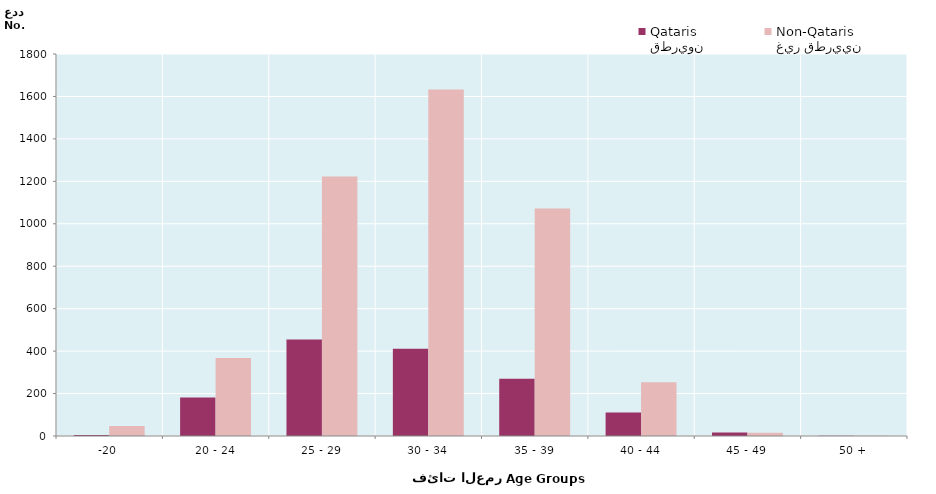
| Category | قطريون
Qataris | غير قطريين
Non-Qataris |
|---|---|---|
| -20 | 5 | 47 |
| 20 - 24 | 182 | 368 |
| 25 - 29 | 455 | 1223 |
| 30 - 34 | 411 | 1633 |
| 35 - 39 | 270 | 1072 |
| 40 - 44 | 111 | 253 |
| 45 - 49 | 16 | 15 |
| 50 + | 1 | 1 |